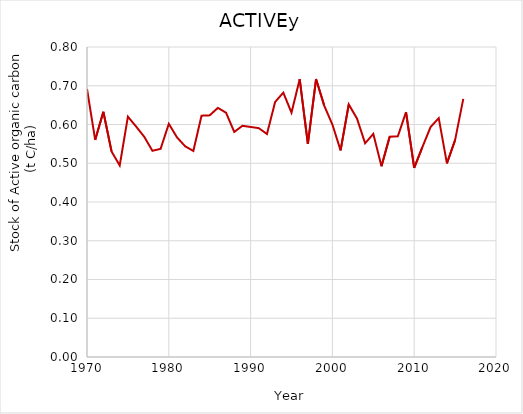
| Category | Series 0 |
|---|---|
| 1970.0 | 0.692 |
| 1971.0 | 0.56 |
| 1972.0 | 0.633 |
| 1973.0 | 0.531 |
| 1974.0 | 0.494 |
| 1975.0 | 0.62 |
| 1976.0 | 0.595 |
| 1977.0 | 0.568 |
| 1978.0 | 0.532 |
| 1979.0 | 0.537 |
| 1980.0 | 0.602 |
| 1981.0 | 0.567 |
| 1982.0 | 0.544 |
| 1983.0 | 0.532 |
| 1984.0 | 0.623 |
| 1985.0 | 0.624 |
| 1986.0 | 0.643 |
| 1987.0 | 0.63 |
| 1988.0 | 0.581 |
| 1989.0 | 0.597 |
| 1990.0 | 0.594 |
| 1991.0 | 0.591 |
| 1992.0 | 0.575 |
| 1993.0 | 0.658 |
| 1994.0 | 0.682 |
| 1995.0 | 0.631 |
| 1996.0 | 0.717 |
| 1997.0 | 0.55 |
| 1998.0 | 0.717 |
| 1999.0 | 0.649 |
| 2000.0 | 0.6 |
| 2001.0 | 0.533 |
| 2002.0 | 0.652 |
| 2003.0 | 0.616 |
| 2004.0 | 0.551 |
| 2005.0 | 0.576 |
| 2006.0 | 0.492 |
| 2007.0 | 0.569 |
| 2008.0 | 0.57 |
| 2009.0 | 0.632 |
| 2010.0 | 0.488 |
| 2011.0 | 0.542 |
| 2012.0 | 0.593 |
| 2013.0 | 0.616 |
| 2014.0 | 0.5 |
| 2015.0 | 0.56 |
| 2016.0 | 0.666 |